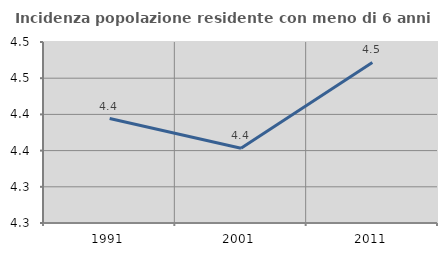
| Category | Incidenza popolazione residente con meno di 6 anni |
|---|---|
| 1991.0 | 4.394 |
| 2001.0 | 4.353 |
| 2011.0 | 4.472 |